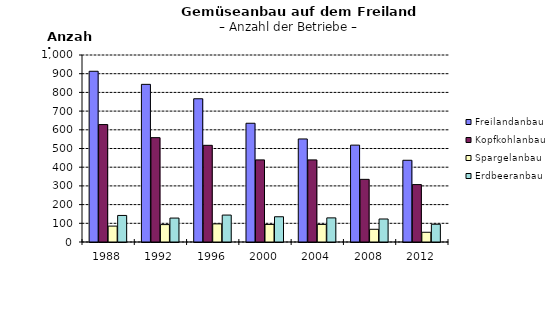
| Category | Freilandanbau | Kopfkohlanbau | Spargelanbau | Erdbeeranbau |
|---|---|---|---|---|
| 1988.0 | 913 | 628 | 85 | 142 |
| 1992.0 | 843 | 558 | 93 | 128 |
| 1996.0 | 766 | 517 | 97 | 144 |
| 2000.0 | 635 | 439 | 94 | 135 |
| 2004.0 | 551 | 439 | 94 | 129 |
| 2008.0 | 518 | 335 | 68 | 123 |
| 2012.0 | 437 | 307 | 52 | 95 |